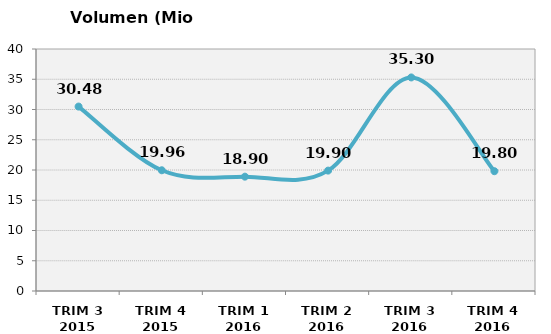
| Category | Volumen (Mio consumiciones) |
|---|---|
| TRIM 3 2015 | 30.484 |
| TRIM 4 2015 | 19.955 |
| TRIM 1 2016 | 18.9 |
| TRIM 2 2016 | 19.9 |
| TRIM 3 2016 | 35.3 |
| TRIM 4 2016 | 19.8 |